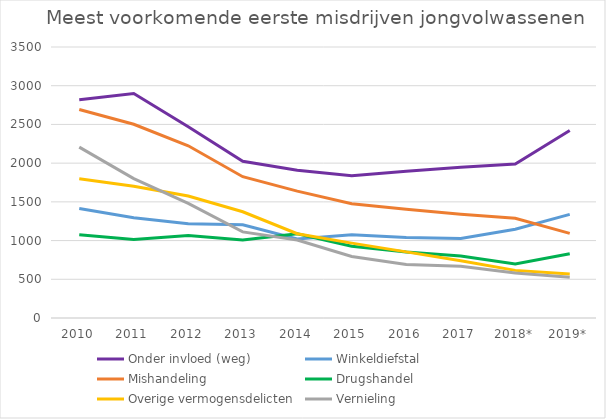
| Category | Onder invloed (weg) | Winkeldiefstal | Mishandeling | Drugshandel | Overige vermogensdelicten | Vernieling |
|---|---|---|---|---|---|---|
| 2010 | 2820 | 1415 | 2693 | 1074 | 1797 | 2207 |
| 2011 | 2899 | 1295 | 2502 | 1014 | 1702 | 1800 |
| 2012 | 2470 | 1217 | 2224 | 1065 | 1576 | 1481 |
| 2013 | 2024 | 1204 | 1825 | 1009 | 1372 | 1112 |
| 2014 | 1907 | 1020 | 1639 | 1089 | 1089 | 1008 |
| 2015 | 1836 | 1075 | 1476 | 927 | 967 | 794 |
| 2016 | 1896 | 1039 | 1405 | 851 | 854 | 691 |
| 2017 | 1946 | 1026 | 1339 | 800 | 739 | 669 |
| 2018* | 1990 | 1146 | 1287 | 698 | 615 | 580 |
| 2019* | 2422 | 1339 | 1093 | 829 | 568 | 526 |